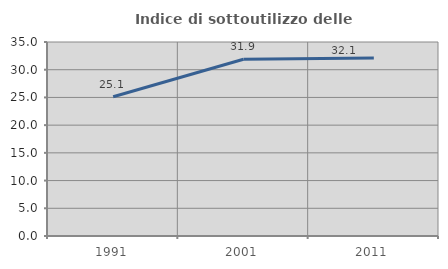
| Category | Indice di sottoutilizzo delle abitazioni  |
|---|---|
| 1991.0 | 25.118 |
| 2001.0 | 31.894 |
| 2011.0 | 32.128 |